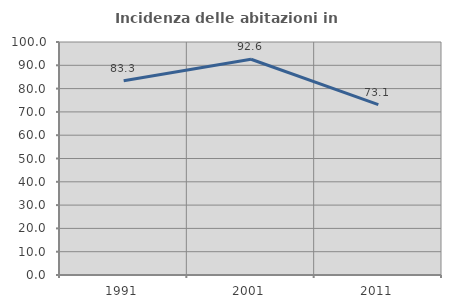
| Category | Incidenza delle abitazioni in proprietà  |
|---|---|
| 1991.0 | 83.333 |
| 2001.0 | 92.593 |
| 2011.0 | 73.134 |